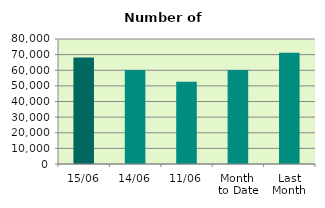
| Category | Series 0 |
|---|---|
| 15/06 | 68134 |
| 14/06 | 60120 |
| 11/06 | 52602 |
| Month 
to Date | 60164.182 |
| Last
Month | 71249.7 |